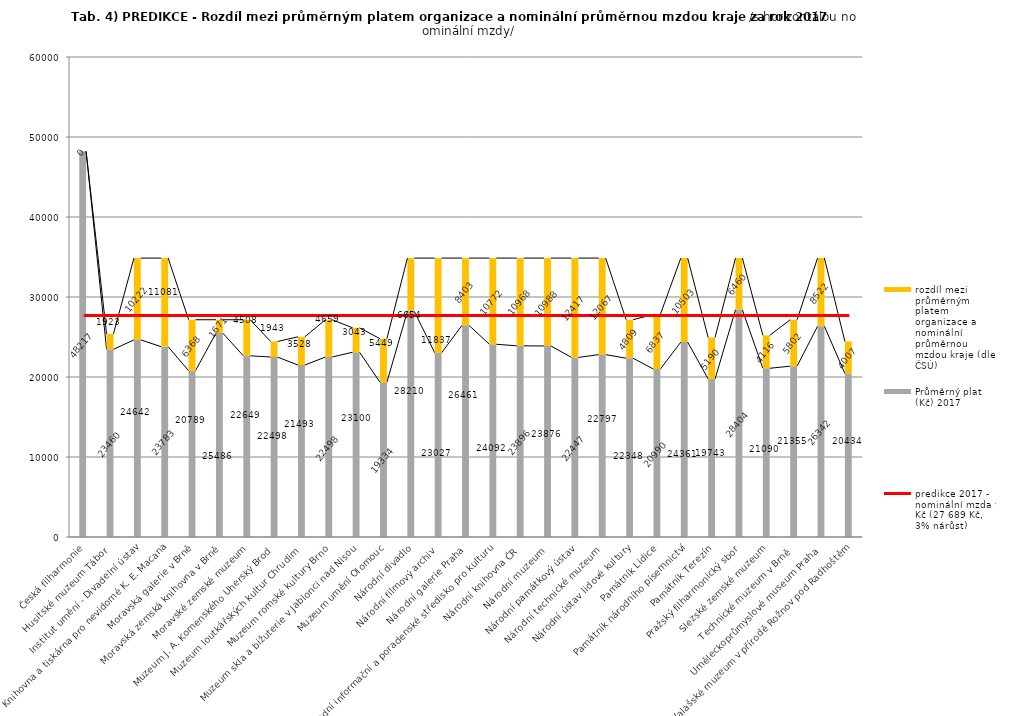
| Category | Průměrný plat (Kč) 2017 | rozdíl mezi průměrným platem organizace a nominální průměrnou mzdou kraje (dle ČSÚ) |
|---|---|---|
| Česká filharmonie | 48217 | 0 |
| Husitské muzeum Tábor | 23460 | 1923 |
| Institut umění - Divadelní ústav | 24642 | 10222 |
| Knihovna a tiskárna pro nevidomé K. E. Macana | 23783 | 11081 |
| Moravská galerie v Brně | 20789 | 6368 |
| Moravská zemská knihovna v Brně | 25486 | 1671 |
| Moravské zemské muzeum | 22649 | 4508 |
| Muzeum J. A. Komenského Uherský Brod | 22498 | 1943 |
| Muzeum loutkářských kultur Chrudim | 21493 | 3528 |
| Muzeum romské kultury Brno | 22498 | 4659 |
| Muzeum skla a bižuterie v Jablonci nad Nisou | 23100 | 3043 |
| Muzeum umění Olomouc | 19334 | 5449 |
| Národní divadlo | 28210 | 6654 |
| Národní filmový archiv | 23027 | 11837 |
| Národní galerie Praha | 26461 | 8403 |
| Národní informační a poradenské středisko pro kulturu | 24092 | 10772 |
| Národní knihovna ČR | 23896 | 10968 |
| Národní muzeum | 23876 | 10988 |
| Národní památkový ústav | 22447 | 12417 |
| Národní technické muzeum | 22797 | 12067 |
| Národní ústav lidové kultury | 22348 | 4809 |
| Památník Lidice | 20990 | 6837 |
| Památník národního písemnictví | 24361 | 10503 |
| Památník Terezín | 19743 | 5190 |
| Pražský filharmonický sbor | 28404 | 6460 |
| Slezské zemské muzeum | 21090 | 4116 |
| Technické muzeum v Brně  | 21355 | 5802 |
| Uměleckoprůmyslové museum Praha | 26342 | 8522 |
| Valašské muzeum v přírodě Rožnov pod Radhoštěm | 20434 | 4007 |